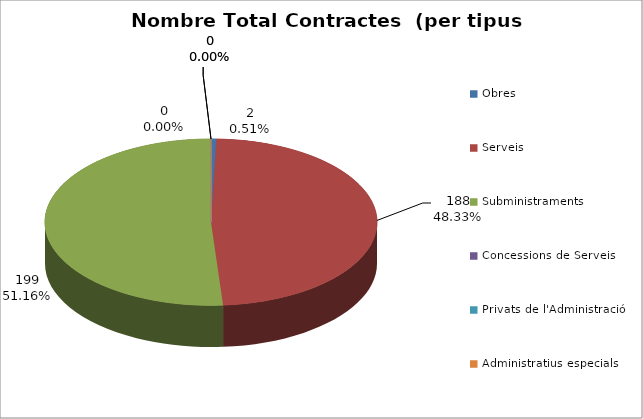
| Category | Nombre Total Contractes |
|---|---|
| Obres | 2 |
| Serveis | 188 |
| Subministraments | 199 |
| Concessions de Serveis | 0 |
| Privats de l'Administració | 0 |
| Administratius especials | 0 |